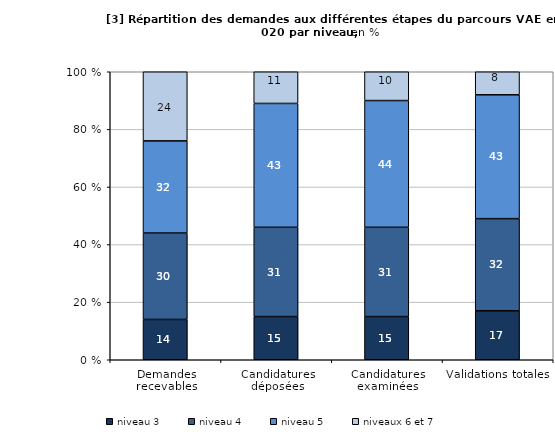
| Category | niveau 3 | niveau 4 | niveau 5 | niveaux 6 et 7 |
|---|---|---|---|---|
| Demandes recevables | 14 | 30 | 32 | 24 |
| Candidatures déposées | 15 | 31 | 43 | 11 |
| Candidatures examinées | 15 | 31 | 44 | 10 |
| Validations totales | 17 | 32 | 43 | 8 |